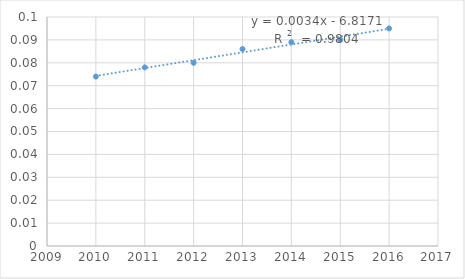
| Category | Series 0 |
|---|---|
| 2010.0 | 0.074 |
| 2011.0 | 0.078 |
| 2012.0 | 0.08 |
| 2013.0 | 0.086 |
| 2014.0 | 0.089 |
| 2015.0 | 0.09 |
| 2016.0 | 0.095 |